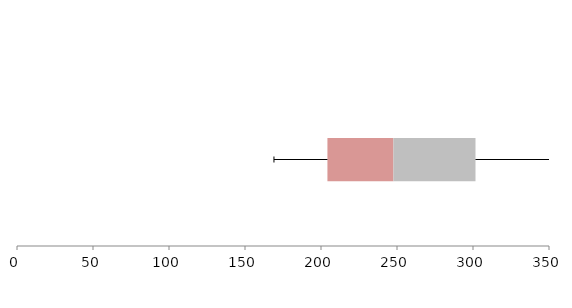
| Category | Series 1 | Series 2 | Series 3 |
|---|---|---|---|
| 0 | 204.23 | 43.402 | 54.005 |